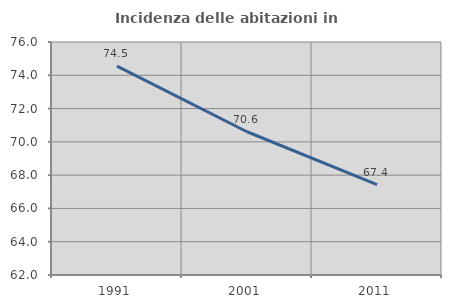
| Category | Incidenza delle abitazioni in proprietà  |
|---|---|
| 1991.0 | 74.549 |
| 2001.0 | 70.607 |
| 2011.0 | 67.424 |